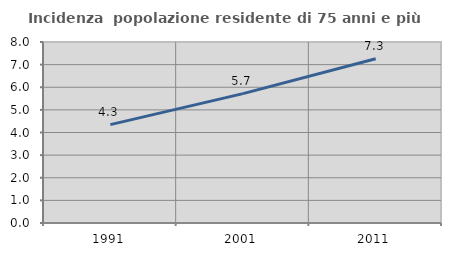
| Category | Incidenza  popolazione residente di 75 anni e più |
|---|---|
| 1991.0 | 4.349 |
| 2001.0 | 5.718 |
| 2011.0 | 7.258 |